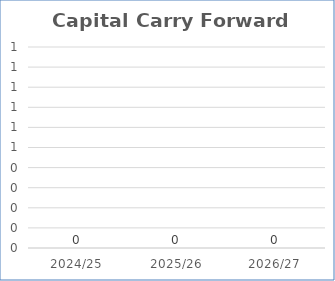
| Category | Series 0 |
|---|---|
| 2024/25 | 0 |
| 2025/26 | 0 |
| 2026/27 | 0 |